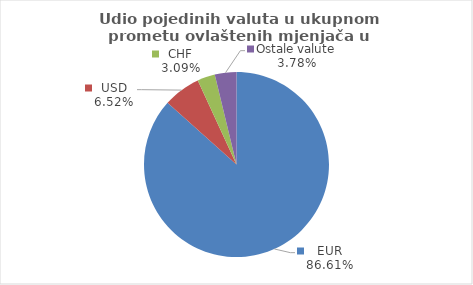
| Category | Series 0 |
|---|---|
| EUR | 86.613 |
| USD | 6.521 |
| CHF | 3.083 |
| Ostale valute | 3.783 |